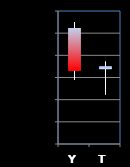
| Category | Series 0 | Series 1 | Series 2 | Series 3 |
|---|---|---|---|---|
| Y | 1.542 | 1.545 | 1.519 | 1.523 |
| T | 1.524 | 1.527 | 1.512 | 1.525 |